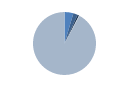
| Category | Series 0 |
|---|---|
| 0 | 116 |
| 1 | 57 |
| 2 | 23 |
| 3 | 6 |
| 4 | 2347 |